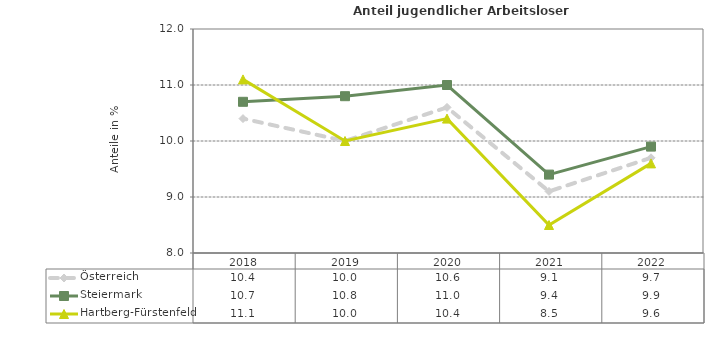
| Category | Österreich | Steiermark | Hartberg-Fürstenfeld |
|---|---|---|---|
| 2022.0 | 9.7 | 9.9 | 9.6 |
| 2021.0 | 9.1 | 9.4 | 8.5 |
| 2020.0 | 10.6 | 11 | 10.4 |
| 2019.0 | 10 | 10.8 | 10 |
| 2018.0 | 10.4 | 10.7 | 11.1 |